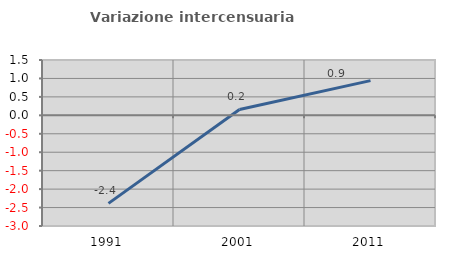
| Category | Variazione intercensuaria annua |
|---|---|
| 1991.0 | -2.387 |
| 2001.0 | 0.16 |
| 2011.0 | 0.94 |